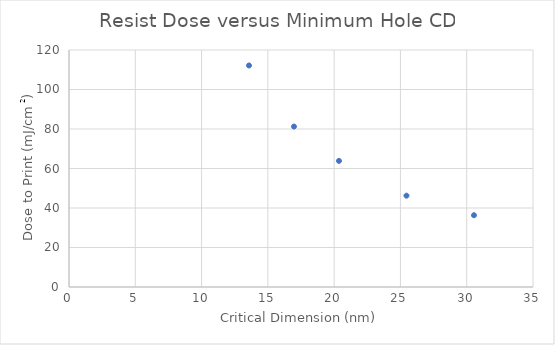
| Category | Resist Dose versus Miniumu Hole CD |
|---|---|
| 30.547012947258857 | 36.346 |
| 25.45584412271571 | 46.246 |
| 20.36467529817257 | 63.848 |
| 16.97056274847714 | 81.239 |
| 13.576450198781712 | 112.161 |